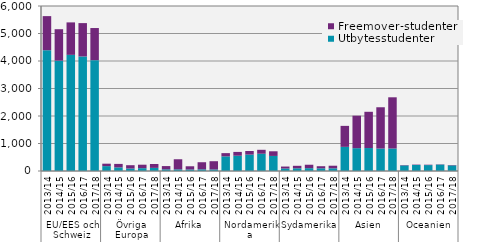
| Category | Utbytesstudenter | Freemover-studenter |
|---|---|---|
| 0 | 4392 | 1240 |
| 1 | 4013 | 1143 |
| 2 | 4224 | 1180 |
| 3 | 4165 | 1213 |
| 4 | 4031 | 1168 |
| 5 | 177 | 89 |
| 6 | 131 | 127 |
| 7 | 91 | 120 |
| 8 | 103 | 126 |
| 9 | 114 | 140 |
| 10 | 61 | 118 |
| 11 | 60 | 367 |
| 12 | 56 | 116 |
| 13 | 61 | 258 |
| 14 | 57 | 299 |
| 15 | 532 | 118 |
| 16 | 556 | 138 |
| 17 | 596 | 131 |
| 18 | 628 | 143 |
| 19 | 548 | 169 |
| 20 | 91 | 71 |
| 21 | 98 | 91 |
| 22 | 103 | 125 |
| 23 | 97 | 77 |
| 24 | 97 | 95 |
| 25 | 878 | 763 |
| 26 | 830 | 1181 |
| 27 | 835 | 1318 |
| 28 | 817 | 1501 |
| 29 | 818 | 1862 |
| 30 | 203 | 13 |
| 31 | 220 | 13 |
| 32 | 215 | 14 |
| 33 | 233 | 10 |
| 34 | 205 | 14 |